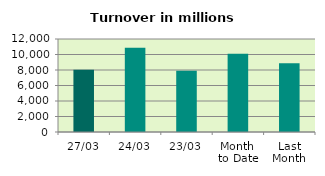
| Category | Series 0 |
|---|---|
| 27/03 | 8042.344 |
| 24/03 | 10855.579 |
| 23/03 | 7890.673 |
| Month 
to Date | 10082.895 |
| Last
Month | 8884.685 |